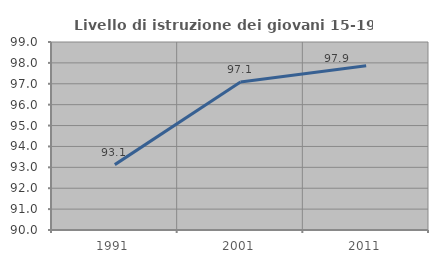
| Category | Livello di istruzione dei giovani 15-19 anni |
|---|---|
| 1991.0 | 93.13 |
| 2001.0 | 97.08 |
| 2011.0 | 97.865 |